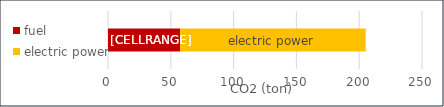
| Category | fuel | electric power |
|---|---|---|
| 0 | 57.327 | 147.826 |